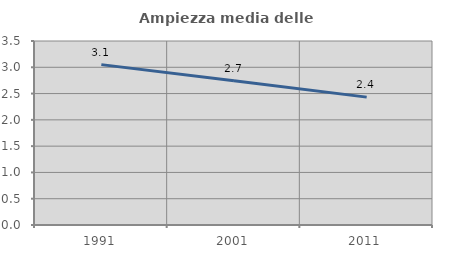
| Category | Ampiezza media delle famiglie |
|---|---|
| 1991.0 | 3.051 |
| 2001.0 | 2.745 |
| 2011.0 | 2.432 |